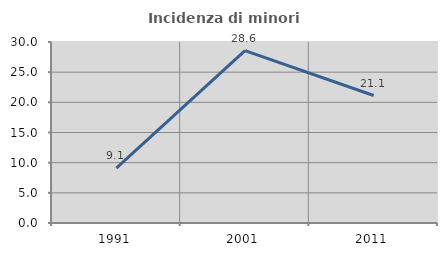
| Category | Incidenza di minori stranieri |
|---|---|
| 1991.0 | 9.091 |
| 2001.0 | 28.571 |
| 2011.0 | 21.127 |